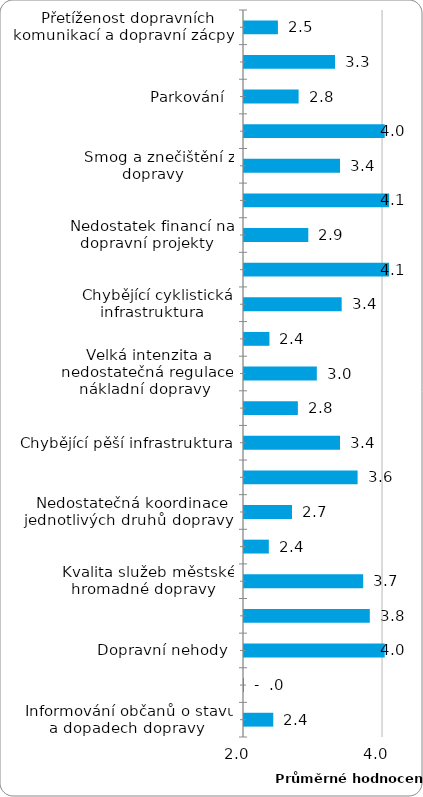
| Category | Series 0 |
|---|---|
|  Přetíženost dopravních komunikací a dopravní zácpy  | 2.488 |
|  Velká intenzita a nedostatečná regulace osobní automobilové dopravy  | 3.31 |
|  Parkování  | 2.786 |
|  Hluk z dopravy  | 4.024 |
|  Smog a znečištění z dopravy  | 3.381 |
|  Tranzitní doprava  | 4.143 |
|  Nedostatek financí na dopravní projekty  | 2.925 |
|  Chybějící silniční infrastruktura  | 4.143 |
|  Chybějící cyklistická infrastruktura  | 3.405 |
|  Schvalovací procesy pro nová opatření | 2.366 |
|  Velká intenzita a nedostatečná regulace nákladní dopravy  | 3.048 |
|  Nedostatečná údržba infrastruktury  | 2.775 |
|  Chybějící pěší infrastruktura  | 3.381 |
|  Nízká míra kooperace ostatních MČ, MHMP, jiných zainteresovaných institucí, občanských sdružení a společností  | 3.634 |
|  Nedostatečná koordinace jednotlivých druhů dopravy  | 2.69 |
|  Nedostatečné propojení veřejnou dopravou s dalšími MČ a obcemi  | 2.357 |
|  Kvalita služeb městské hromadné dopravy  | 3.714 |
|  Nekompaktnost města – špatná dopravní obslužnost méně zalidněných území  | 3.81 |
|  Dopravní nehody  | 4.024 |
|  Nízká poptávka občanů po rozvoji udržitelné dopravy | 0 |
|  Informování občanů o stavu a dopadech dopravy | 2.421 |